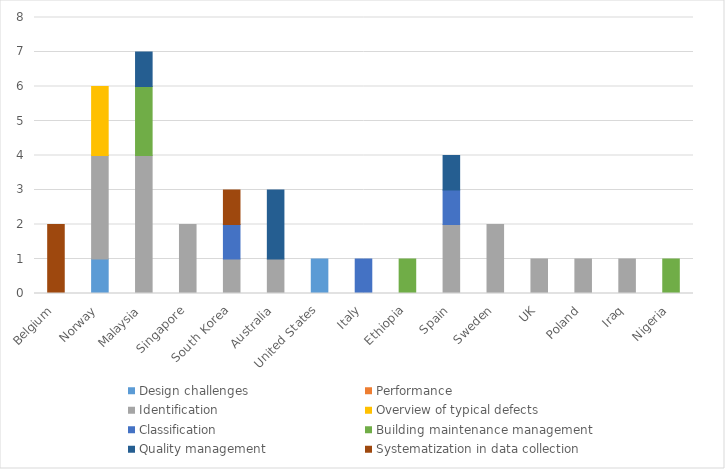
| Category | Design challenges | Performance | Identification | Overview of typical defects | Classification | Building maintenance management | Quality management | Systematization in data collection  |
|---|---|---|---|---|---|---|---|---|
| Belgium | 0 | 0 | 0 | 0 | 0 | 0 | 0 | 2 |
| Norway | 1 | 0 | 3 | 2 | 0 | 0 | 0 | 0 |
| Malaysia | 0 | 0 | 4 | 0 | 0 | 2 | 1 | 0 |
| Singapore | 0 | 0 | 2 | 0 | 0 | 0 | 0 | 0 |
| South Korea | 0 | 0 | 1 | 0 | 1 | 0 | 0 | 1 |
| Australia | 0 | 0 | 1 | 0 | 0 | 0 | 2 | 0 |
| United States | 1 | 0 | 0 | 0 | 0 | 0 | 0 | 0 |
| Italy | 0 | 0 | 0 | 0 | 1 | 0 | 0 | 0 |
| Ethiopia | 0 | 0 | 0 | 0 | 0 | 1 | 0 | 0 |
| Spain | 0 | 0 | 2 | 0 | 1 | 0 | 1 | 0 |
| Sweden | 0 | 0 | 2 | 0 | 0 | 0 | 0 | 0 |
| UK | 0 | 0 | 1 | 0 | 0 | 0 | 0 | 0 |
| Poland | 0 | 0 | 1 | 0 | 0 | 0 | 0 | 0 |
| Iraq | 0 | 0 | 1 | 0 | 0 | 0 | 0 | 0 |
| Nigeria | 0 | 0 | 0 | 0 | 0 | 1 | 0 | 0 |